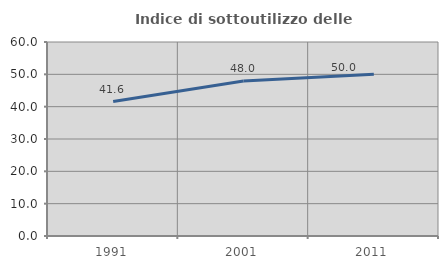
| Category | Indice di sottoutilizzo delle abitazioni  |
|---|---|
| 1991.0 | 41.573 |
| 2001.0 | 47.959 |
| 2011.0 | 50 |